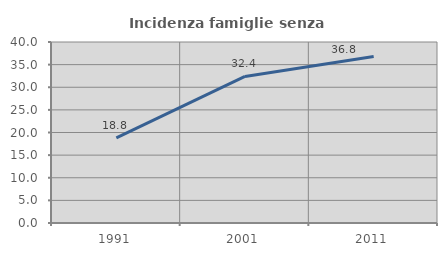
| Category | Incidenza famiglie senza nuclei |
|---|---|
| 1991.0 | 18.834 |
| 2001.0 | 32.394 |
| 2011.0 | 36.792 |